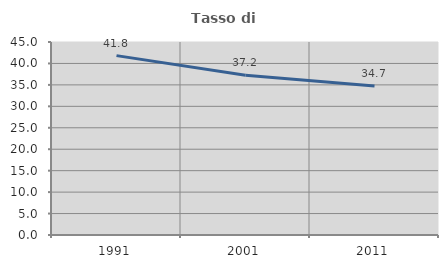
| Category | Tasso di occupazione   |
|---|---|
| 1991.0 | 41.821 |
| 2001.0 | 37.225 |
| 2011.0 | 34.732 |